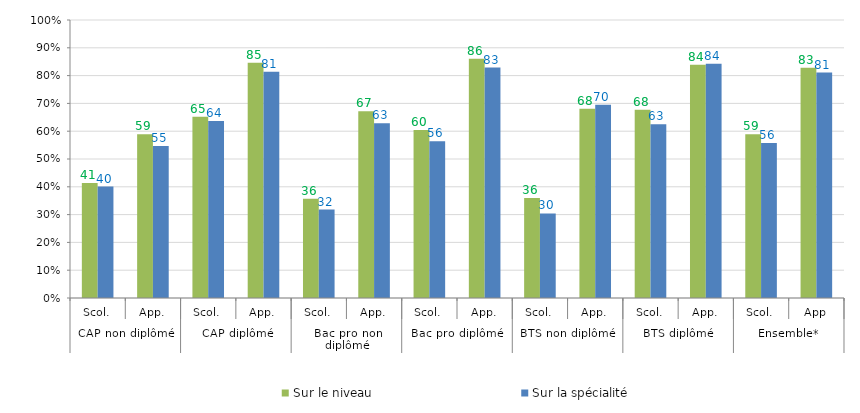
| Category | Sur le niveau | Sur la spécialité |
|---|---|---|
| 0 | 41.4 | 40.1 |
| 1 | 58.9 | 54.7 |
| 2 | 65.2 | 63.7 |
| 3 | 84.6 | 81.4 |
| 4 | 35.7 | 31.8 |
| 5 | 67.2 | 62.9 |
| 6 | 60.4 | 56.4 |
| 7 | 86.1 | 82.9 |
| 8 | 36 | 30.4 |
| 9 | 68.1 | 69.5 |
| 10 | 67.7 | 62.5 |
| 11 | 83.9 | 84.3 |
| 12 | 58.9 | 55.8 |
| 13 | 82.8 | 81.1 |